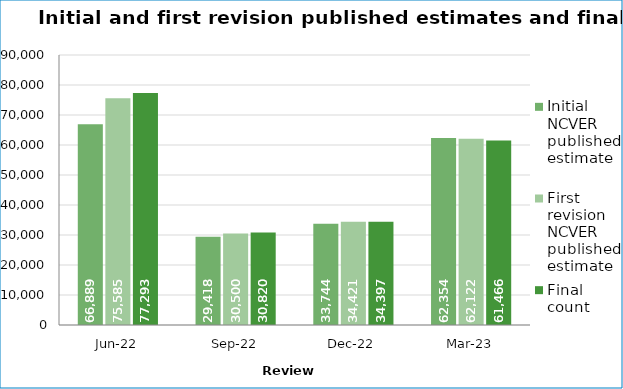
| Category | Initial NCVER published estimate | First revision NCVER published estimate | Final count |
|---|---|---|---|
| 2022-06-01 | 66889 | 75585 | 77293 |
| 2022-09-01 | 29418 | 30500 | 30820 |
| 2022-12-01 | 33744 | 34421 | 34397 |
| 2023-03-01 | 62354.282 | 62122 | 61466 |